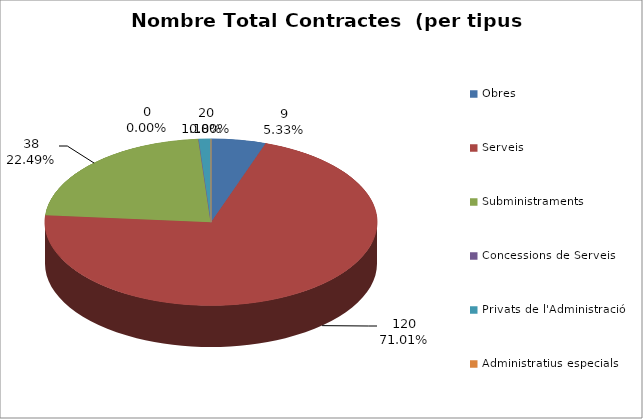
| Category | Nombre Total Contractes |
|---|---|
| Obres | 9 |
| Serveis | 120 |
| Subministraments | 38 |
| Concessions de Serveis | 0 |
| Privats de l'Administració | 2 |
| Administratius especials | 0 |